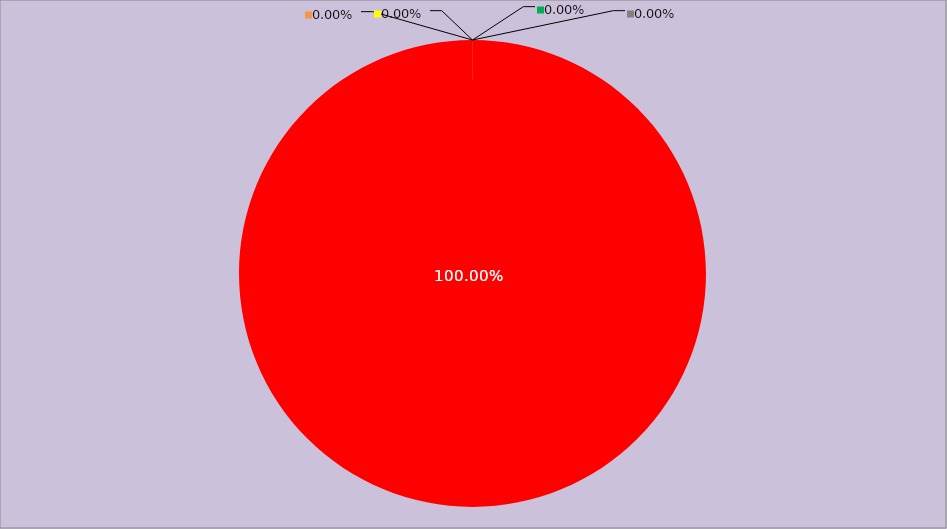
| Category | Année 2028 |
|---|---|
| Mesures non appliquées | 168 |
| Mesures appliquées mais peu ou pas documentées | 0 |
| Mesures appliquées et documentées | 0 |
| Mesures appliquées, documentées et contrôlées | 0 |
| Mesures non applicables | 0 |